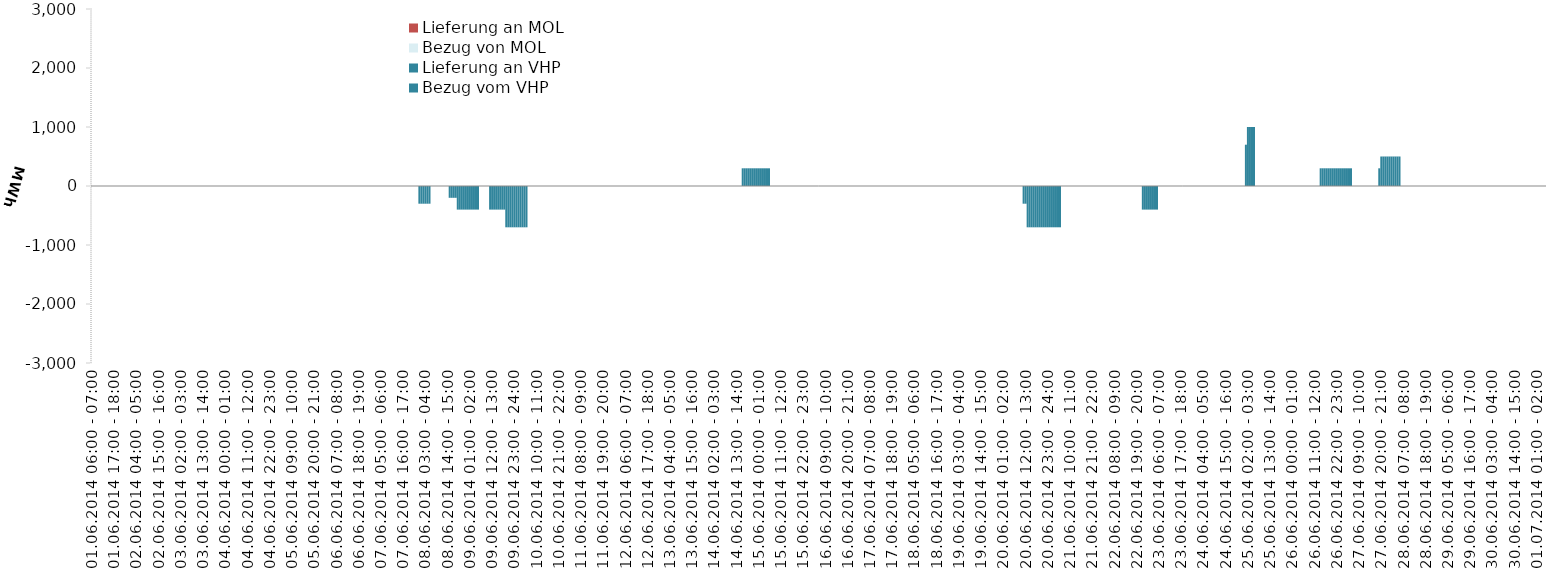
| Category | Bezug vom VHP | Lieferung an VHP | Bezug von MOL | Lieferung an MOL |
|---|---|---|---|---|
| 01.06.2014 06:00 - 07:00 | 0 | 0 | 0 | 0 |
| 01.06.2014 07:00 - 08:00 | 0 | 0 | 0 | 0 |
| 01.06.2014 08:00 - 09:00 | 0 | 0 | 0 | 0 |
| 01.06.2014 09:00 - 10:00 | 0 | 0 | 0 | 0 |
| 01.06.2014 10:00 - 11:00 | 0 | 0 | 0 | 0 |
| 01.06.2014 11:00 - 12:00 | 0 | 0 | 0 | 0 |
| 01.06.2014 12:00 - 13:00 | 0 | 0 | 0 | 0 |
| 01.06.2014 13:00 - 14:00 | 0 | 0 | 0 | 0 |
| 01.06.2014 14:00 - 15:00 | 0 | 0 | 0 | 0 |
| 01.06.2014 15:00 - 16:00 | 0 | 0 | 0 | 0 |
| 01.06.2014 16:00 - 17:00 | 0 | 0 | 0 | 0 |
| 01.06.2014 17:00 - 18:00 | 0 | 0 | 0 | 0 |
| 01.06.2014 18:00 - 19:00 | 0 | 0 | 0 | 0 |
| 01.06.2014 19:00 - 20:00 | 0 | 0 | 0 | 0 |
| 01.06.2014 20:00 - 21:00 | 0 | 0 | 0 | 0 |
| 01.06.2014 21:00 - 22:00 | 0 | 0 | 0 | 0 |
| 01.06.2014 22:00 - 23:00 | 0 | 0 | 0 | 0 |
| 01.06.2014 23:00 - 24:00 | 0 | 0 | 0 | 0 |
| 02.06.2014 00:00 - 01:00 | 0 | 0 | 0 | 0 |
| 02.06.2014 01:00 - 02:00 | 0 | 0 | 0 | 0 |
| 02.06.2014 02:00 - 03:00 | 0 | 0 | 0 | 0 |
| 02.06.2014 03:00 - 04:00 | 0 | 0 | 0 | 0 |
| 02.06.2014 04:00 - 05:00 | 0 | 0 | 0 | 0 |
| 02.06.2014 05:00 - 06:00 | 0 | 0 | 0 | 0 |
| 02.06.2014 06:00 - 07:00 | 0 | 0 | 0 | 0 |
| 02.06.2014 07:00 - 08:00 | 0 | 0 | 0 | 0 |
| 02.06.2014 08:00 - 09:00 | 0 | 0 | 0 | 0 |
| 02.06.2014 09:00 - 10:00 | 0 | 0 | 0 | 0 |
| 02.06.2014 10:00 - 11:00 | 0 | 0 | 0 | 0 |
| 02.06.2014 11:00 - 12:00 | 0 | 0 | 0 | 0 |
| 02.06.2014 12:00 - 13:00 | 0 | 0 | 0 | 0 |
| 02.06.2014 13:00 - 14:00 | 0 | 0 | 0 | 0 |
| 02.06.2014 14:00 - 15:00 | 0 | 0 | 0 | 0 |
| 02.06.2014 15:00 - 16:00 | 0 | 0 | 0 | 0 |
| 02.06.2014 16:00 - 17:00 | 0 | 0 | 0 | 0 |
| 02.06.2014 17:00 - 18:00 | 0 | 0 | 0 | 0 |
| 02.06.2014 18:00 - 19:00 | 0 | 0 | 0 | 0 |
| 02.06.2014 19:00 - 20:00 | 0 | 0 | 0 | 0 |
| 02.06.2014 20:00 - 21:00 | 0 | 0 | 0 | 0 |
| 02.06.2014 21:00 - 22:00 | 0 | 0 | 0 | 0 |
| 02.06.2014 22:00 - 23:00 | 0 | 0 | 0 | 0 |
| 02.06.2014 23:00 - 24:00 | 0 | 0 | 0 | 0 |
| 03.06.2014 00:00 - 01:00 | 0 | 0 | 0 | 0 |
| 03.06.2014 01:00 - 02:00 | 0 | 0 | 0 | 0 |
| 03.06.2014 02:00 - 03:00 | 0 | 0 | 0 | 0 |
| 03.06.2014 03:00 - 04:00 | 0 | 0 | 0 | 0 |
| 03.06.2014 04:00 - 05:00 | 0 | 0 | 0 | 0 |
| 03.06.2014 05:00 - 06:00 | 0 | 0 | 0 | 0 |
| 03.06.2014 06:00 - 07:00 | 0 | 0 | 0 | 0 |
| 03.06.2014 07:00 - 08:00 | 0 | 0 | 0 | 0 |
| 03.06.2014 08:00 - 09:00 | 0 | 0 | 0 | 0 |
| 03.06.2014 09:00 - 10:00 | 0 | 0 | 0 | 0 |
| 03.06.2014 10:00 - 11:00 | 0 | 0 | 0 | 0 |
| 03.06.2014 11:00 - 12:00 | 0 | 0 | 0 | 0 |
| 03.06.2014 12:00 - 13:00 | 0 | 0 | 0 | 0 |
| 03.06.2014 13:00 - 14:00 | 0 | 0 | 0 | 0 |
| 03.06.2014 14:00 - 15:00 | 0 | 0 | 0 | 0 |
| 03.06.2014 15:00 - 16:00 | 0 | 0 | 0 | 0 |
| 03.06.2014 16:00 - 17:00 | 0 | 0 | 0 | 0 |
| 03.06.2014 17:00 - 18:00 | 0 | 0 | 0 | 0 |
| 03.06.2014 18:00 - 19:00 | 0 | 0 | 0 | 0 |
| 03.06.2014 19:00 - 20:00 | 0 | 0 | 0 | 0 |
| 03.06.2014 20:00 - 21:00 | 0 | 0 | 0 | 0 |
| 03.06.2014 21:00 - 22:00 | 0 | 0 | 0 | 0 |
| 03.06.2014 22:00 - 23:00 | 0 | 0 | 0 | 0 |
| 03.06.2014 23:00 - 24:00 | 0 | 0 | 0 | 0 |
| 04.06.2014 00:00 - 01:00 | 0 | 0 | 0 | 0 |
| 04.06.2014 01:00 - 02:00 | 0 | 0 | 0 | 0 |
| 04.06.2014 02:00 - 03:00 | 0 | 0 | 0 | 0 |
| 04.06.2014 03:00 - 04:00 | 0 | 0 | 0 | 0 |
| 04.06.2014 04:00 - 05:00 | 0 | 0 | 0 | 0 |
| 04.06.2014 05:00 - 06:00 | 0 | 0 | 0 | 0 |
| 04.06.2014 06:00 - 07:00 | 0 | 0 | 0 | 0 |
| 04.06.2014 07:00 - 08:00 | 0 | 0 | 0 | 0 |
| 04.06.2014 08:00 - 09:00 | 0 | 0 | 0 | 0 |
| 04.06.2014 09:00 - 10:00 | 0 | 0 | 0 | 0 |
| 04.06.2014 10:00 - 11:00 | 0 | 0 | 0 | 0 |
| 04.06.2014 11:00 - 12:00 | 0 | 0 | 0 | 0 |
| 04.06.2014 12:00 - 13:00 | 0 | 0 | 0 | 0 |
| 04.06.2014 13:00 - 14:00 | 0 | 0 | 0 | 0 |
| 04.06.2014 14:00 - 15:00 | 0 | 0 | 0 | 0 |
| 04.06.2014 15:00 - 16:00 | 0 | 0 | 0 | 0 |
| 04.06.2014 16:00 - 17:00 | 0 | 0 | 0 | 0 |
| 04.06.2014 17:00 - 18:00 | 0 | 0 | 0 | 0 |
| 04.06.2014 18:00 - 19:00 | 0 | 0 | 0 | 0 |
| 04.06.2014 19:00 - 20:00 | 0 | 0 | 0 | 0 |
| 04.06.2014 20:00 - 21:00 | 0 | 0 | 0 | 0 |
| 04.06.2014 21:00 - 22:00 | 0 | 0 | 0 | 0 |
| 04.06.2014 22:00 - 23:00 | 0 | 0 | 0 | 0 |
| 04.06.2014 23:00 - 24:00 | 0 | 0 | 0 | 0 |
| 05.06.2014 00:00 - 01:00 | 0 | 0 | 0 | 0 |
| 05.06.2014 01:00 - 02:00 | 0 | 0 | 0 | 0 |
| 05.06.2014 02:00 - 03:00 | 0 | 0 | 0 | 0 |
| 05.06.2014 03:00 - 04:00 | 0 | 0 | 0 | 0 |
| 05.06.2014 04:00 - 05:00 | 0 | 0 | 0 | 0 |
| 05.06.2014 05:00 - 06:00 | 0 | 0 | 0 | 0 |
| 05.06.2014 06:00 - 07:00 | 0 | 0 | 0 | 0 |
| 05.06.2014 07:00 - 08:00 | 0 | 0 | 0 | 0 |
| 05.06.2014 08:00 - 09:00 | 0 | 0 | 0 | 0 |
| 05.06.2014 09:00 - 10:00 | 0 | 0 | 0 | 0 |
| 05.06.2014 10:00 - 11:00 | 0 | 0 | 0 | 0 |
| 05.06.2014 11:00 - 12:00 | 0 | 0 | 0 | 0 |
| 05.06.2014 12:00 - 13:00 | 0 | 0 | 0 | 0 |
| 05.06.2014 13:00 - 14:00 | 0 | 0 | 0 | 0 |
| 05.06.2014 14:00 - 15:00 | 0 | 0 | 0 | 0 |
| 05.06.2014 15:00 - 16:00 | 0 | 0 | 0 | 0 |
| 05.06.2014 16:00 - 17:00 | 0 | 0 | 0 | 0 |
| 05.06.2014 17:00 - 18:00 | 0 | 0 | 0 | 0 |
| 05.06.2014 18:00 - 19:00 | 0 | 0 | 0 | 0 |
| 05.06.2014 19:00 - 20:00 | 0 | 0 | 0 | 0 |
| 05.06.2014 20:00 - 21:00 | 0 | 0 | 0 | 0 |
| 05.06.2014 21:00 - 22:00 | 0 | 0 | 0 | 0 |
| 05.06.2014 22:00 - 23:00 | 0 | 0 | 0 | 0 |
| 05.06.2014 23:00 - 24:00 | 0 | 0 | 0 | 0 |
| 06.06.2014 00:00 - 01:00 | 0 | 0 | 0 | 0 |
| 06.06.2014 01:00 - 02:00 | 0 | 0 | 0 | 0 |
| 06.06.2014 02:00 - 03:00 | 0 | 0 | 0 | 0 |
| 06.06.2014 03:00 - 04:00 | 0 | 0 | 0 | 0 |
| 06.06.2014 04:00 - 05:00 | 0 | 0 | 0 | 0 |
| 06.06.2014 05:00 - 06:00 | 0 | 0 | 0 | 0 |
| 06.06.2014 06:00 - 07:00 | 0 | 0 | 0 | 0 |
| 06.06.2014 07:00 - 08:00 | 0 | 0 | 0 | 0 |
| 06.06.2014 08:00 - 09:00 | 0 | 0 | 0 | 0 |
| 06.06.2014 09:00 - 10:00 | 0 | 0 | 0 | 0 |
| 06.06.2014 10:00 - 11:00 | 0 | 0 | 0 | 0 |
| 06.06.2014 11:00 - 12:00 | 0 | 0 | 0 | 0 |
| 06.06.2014 12:00 - 13:00 | 0 | 0 | 0 | 0 |
| 06.06.2014 13:00 - 14:00 | 0 | 0 | 0 | 0 |
| 06.06.2014 14:00 - 15:00 | 0 | 0 | 0 | 0 |
| 06.06.2014 15:00 - 16:00 | 0 | 0 | 0 | 0 |
| 06.06.2014 16:00 - 17:00 | 0 | 0 | 0 | 0 |
| 06.06.2014 17:00 - 18:00 | 0 | 0 | 0 | 0 |
| 06.06.2014 18:00 - 19:00 | 0 | 0 | 0 | 0 |
| 06.06.2014 19:00 - 20:00 | 0 | 0 | 0 | 0 |
| 06.06.2014 20:00 - 21:00 | 0 | 0 | 0 | 0 |
| 06.06.2014 21:00 - 22:00 | 0 | 0 | 0 | 0 |
| 06.06.2014 22:00 - 23:00 | 0 | 0 | 0 | 0 |
| 06.06.2014 23:00 - 24:00 | 0 | 0 | 0 | 0 |
| 07.06.2014 00:00 - 01:00 | 0 | 0 | 0 | 0 |
| 07.06.2014 01:00 - 02:00 | 0 | 0 | 0 | 0 |
| 07.06.2014 02:00 - 03:00 | 0 | 0 | 0 | 0 |
| 07.06.2014 03:00 - 04:00 | 0 | 0 | 0 | 0 |
| 07.06.2014 04:00 - 05:00 | 0 | 0 | 0 | 0 |
| 07.06.2014 05:00 - 06:00 | 0 | 0 | 0 | 0 |
| 07.06.2014 06:00 - 07:00 | 0 | 0 | 0 | 0 |
| 07.06.2014 07:00 - 08:00 | 0 | 0 | 0 | 0 |
| 07.06.2014 08:00 - 09:00 | 0 | 0 | 0 | 0 |
| 07.06.2014 09:00 - 10:00 | 0 | 0 | 0 | 0 |
| 07.06.2014 10:00 - 11:00 | 0 | 0 | 0 | 0 |
| 07.06.2014 11:00 - 12:00 | 0 | 0 | 0 | 0 |
| 07.06.2014 12:00 - 13:00 | 0 | 0 | 0 | 0 |
| 07.06.2014 13:00 - 14:00 | 0 | 0 | 0 | 0 |
| 07.06.2014 14:00 - 15:00 | 0 | 0 | 0 | 0 |
| 07.06.2014 15:00 - 16:00 | 0 | 0 | 0 | 0 |
| 07.06.2014 16:00 - 17:00 | 0 | 0 | 0 | 0 |
| 07.06.2014 17:00 - 18:00 | 0 | 0 | 0 | 0 |
| 07.06.2014 18:00 - 19:00 | 0 | 0 | 0 | 0 |
| 07.06.2014 19:00 - 20:00 | 0 | 0 | 0 | 0 |
| 07.06.2014 20:00 - 21:00 | 0 | 0 | 0 | 0 |
| 07.06.2014 21:00 - 22:00 | 0 | 0 | 0 | 0 |
| 07.06.2014 22:00 - 23:00 | 0 | 0 | 0 | 0 |
| 07.06.2014 23:00 - 24:00 | 0 | 0 | 0 | 0 |
| 08.06.2014 00:00 - 01:00 | 0 | -300 | 0 | 0 |
| 08.06.2014 01:00 - 02:00 | 0 | -300 | 0 | 0 |
| 08.06.2014 02:00 - 03:00 | 0 | -300 | 0 | 0 |
| 08.06.2014 03:00 - 04:00 | 0 | -300 | 0 | 0 |
| 08.06.2014 04:00 - 05:00 | 0 | -300 | 0 | 0 |
| 08.06.2014 05:00 - 06:00 | 0 | -300 | 0 | 0 |
| 08.06.2014 06:00 - 07:00 | 0 | 0 | 0 | 0 |
| 08.06.2014 07:00 - 08:00 | 0 | 0 | 0 | 0 |
| 08.06.2014 08:00 - 09:00 | 0 | 0 | 0 | 0 |
| 08.06.2014 09:00 - 10:00 | 0 | 0 | 0 | 0 |
| 08.06.2014 10:00 - 11:00 | 0 | 0 | 0 | 0 |
| 08.06.2014 11:00 - 12:00 | 0 | 0 | 0 | 0 |
| 08.06.2014 12:00 - 13:00 | 0 | 0 | 0 | 0 |
| 08.06.2014 13:00 - 14:00 | 0 | 0 | 0 | 0 |
| 08.06.2014 14:00 - 15:00 | 0 | 0 | 0 | 0 |
| 08.06.2014 15:00 - 16:00 | 0 | -200 | 0 | 0 |
| 08.06.2014 16:00 - 17:00 | 0 | -200 | 0 | 0 |
| 08.06.2014 17:00 - 18:00 | 0 | -200 | 0 | 0 |
| 08.06.2014 18:00 - 19:00 | 0 | -200 | 0 | 0 |
| 08.06.2014 19:00 - 20:00 | 0 | -400 | 0 | 0 |
| 08.06.2014 20:00 - 21:00 | 0 | -400 | 0 | 0 |
| 08.06.2014 21:00 - 22:00 | 0 | -400 | 0 | 0 |
| 08.06.2014 22:00 - 23:00 | 0 | -400 | 0 | 0 |
| 08.06.2014 23:00 - 24:00 | 0 | -400 | 0 | 0 |
| 09.06.2014 00:00 - 01:00 | 0 | -400 | 0 | 0 |
| 09.06.2014 01:00 - 02:00 | 0 | -400 | 0 | 0 |
| 09.06.2014 02:00 - 03:00 | 0 | -400 | 0 | 0 |
| 09.06.2014 03:00 - 04:00 | 0 | -400 | 0 | 0 |
| 09.06.2014 04:00 - 05:00 | 0 | -400 | 0 | 0 |
| 09.06.2014 05:00 - 06:00 | 0 | -400 | 0 | 0 |
| 09.06.2014 06:00 - 07:00 | 0 | 0 | 0 | 0 |
| 09.06.2014 07:00 - 08:00 | 0 | 0 | 0 | 0 |
| 09.06.2014 08:00 - 09:00 | 0 | 0 | 0 | 0 |
| 09.06.2014 09:00 - 10:00 | 0 | 0 | 0 | 0 |
| 09.06.2014 10:00 - 11:00 | 0 | 0 | 0 | 0 |
| 09.06.2014 11:00 - 12:00 | 0 | -400 | 0 | 0 |
| 09.06.2014 12:00 - 13:00 | 0 | -400 | 0 | 0 |
| 09.06.2014 13:00 - 14:00 | 0 | -400 | 0 | 0 |
| 09.06.2014 14:00 - 15:00 | 0 | -400 | 0 | 0 |
| 09.06.2014 15:00 - 16:00 | 0 | -400 | 0 | 0 |
| 09.06.2014 16:00 - 17:00 | 0 | -400 | 0 | 0 |
| 09.06.2014 17:00 - 18:00 | 0 | -400 | 0 | 0 |
| 09.06.2014 18:00 - 19:00 | 0 | -400 | 0 | 0 |
| 09.06.2014 19:00 - 20:00 | 0 | -700 | 0 | 0 |
| 09.06.2014 20:00 - 21:00 | 0 | -700 | 0 | 0 |
| 09.06.2014 21:00 - 22:00 | 0 | -700 | 0 | 0 |
| 09.06.2014 22:00 - 23:00 | 0 | -700 | 0 | 0 |
| 09.06.2014 23:00 - 24:00 | 0 | -700 | 0 | 0 |
| 10.06.2014 00:00 - 01:00 | 0 | -700 | 0 | 0 |
| 10.06.2014 01:00 - 02:00 | 0 | -700 | 0 | 0 |
| 10.06.2014 02:00 - 03:00 | 0 | -700 | 0 | 0 |
| 10.06.2014 03:00 - 04:00 | 0 | -700 | 0 | 0 |
| 10.06.2014 04:00 - 05:00 | 0 | -700 | 0 | 0 |
| 10.06.2014 05:00 - 06:00 | 0 | -700 | 0 | 0 |
| 10.06.2014 06:00 - 07:00 | 0 | 0 | 0 | 0 |
| 10.06.2014 07:00 - 08:00 | 0 | 0 | 0 | 0 |
| 10.06.2014 08:00 - 09:00 | 0 | 0 | 0 | 0 |
| 10.06.2014 09:00 - 10:00 | 0 | 0 | 0 | 0 |
| 10.06.2014 10:00 - 11:00 | 0 | 0 | 0 | 0 |
| 10.06.2014 11:00 - 12:00 | 0 | 0 | 0 | 0 |
| 10.06.2014 12:00 - 13:00 | 0 | 0 | 0 | 0 |
| 10.06.2014 13:00 - 14:00 | 0 | 0 | 0 | 0 |
| 10.06.2014 14:00 - 15:00 | 0 | 0 | 0 | 0 |
| 10.06.2014 15:00 - 16:00 | 0 | 0 | 0 | 0 |
| 10.06.2014 16:00 - 17:00 | 0 | 0 | 0 | 0 |
| 10.06.2014 17:00 - 18:00 | 0 | 0 | 0 | 0 |
| 10.06.2014 18:00 - 19:00 | 0 | 0 | 0 | 0 |
| 10.06.2014 19:00 - 20:00 | 0 | 0 | 0 | 0 |
| 10.06.2014 20:00 - 21:00 | 0 | 0 | 0 | 0 |
| 10.06.2014 21:00 - 22:00 | 0 | 0 | 0 | 0 |
| 10.06.2014 22:00 - 23:00 | 0 | 0 | 0 | 0 |
| 10.06.2014 23:00 - 24:00 | 0 | 0 | 0 | 0 |
| 11.06.2014 00:00 - 01:00 | 0 | 0 | 0 | 0 |
| 11.06.2014 01:00 - 02:00 | 0 | 0 | 0 | 0 |
| 11.06.2014 02:00 - 03:00 | 0 | 0 | 0 | 0 |
| 11.06.2014 03:00 - 04:00 | 0 | 0 | 0 | 0 |
| 11.06.2014 04:00 - 05:00 | 0 | 0 | 0 | 0 |
| 11.06.2014 05:00 - 06:00 | 0 | 0 | 0 | 0 |
| 11.06.2014 06:00 - 07:00 | 0 | 0 | 0 | 0 |
| 11.06.2014 07:00 - 08:00 | 0 | 0 | 0 | 0 |
| 11.06.2014 08:00 - 09:00 | 0 | 0 | 0 | 0 |
| 11.06.2014 09:00 - 10:00 | 0 | 0 | 0 | 0 |
| 11.06.2014 10:00 - 11:00 | 0 | 0 | 0 | 0 |
| 11.06.2014 11:00 - 12:00 | 0 | 0 | 0 | 0 |
| 11.06.2014 12:00 - 13:00 | 0 | 0 | 0 | 0 |
| 11.06.2014 13:00 - 14:00 | 0 | 0 | 0 | 0 |
| 11.06.2014 14:00 - 15:00 | 0 | 0 | 0 | 0 |
| 11.06.2014 15:00 - 16:00 | 0 | 0 | 0 | 0 |
| 11.06.2014 16:00 - 17:00 | 0 | 0 | 0 | 0 |
| 11.06.2014 17:00 - 18:00 | 0 | 0 | 0 | 0 |
| 11.06.2014 18:00 - 19:00 | 0 | 0 | 0 | 0 |
| 11.06.2014 19:00 - 20:00 | 0 | 0 | 0 | 0 |
| 11.06.2014 20:00 - 21:00 | 0 | 0 | 0 | 0 |
| 11.06.2014 21:00 - 22:00 | 0 | 0 | 0 | 0 |
| 11.06.2014 22:00 - 23:00 | 0 | 0 | 0 | 0 |
| 11.06.2014 23:00 - 24:00 | 0 | 0 | 0 | 0 |
| 12.06.2014 00:00 - 01:00 | 0 | 0 | 0 | 0 |
| 12.06.2014 01:00 - 02:00 | 0 | 0 | 0 | 0 |
| 12.06.2014 02:00 - 03:00 | 0 | 0 | 0 | 0 |
| 12.06.2014 03:00 - 04:00 | 0 | 0 | 0 | 0 |
| 12.06.2014 04:00 - 05:00 | 0 | 0 | 0 | 0 |
| 12.06.2014 05:00 - 06:00 | 0 | 0 | 0 | 0 |
| 12.06.2014 06:00 - 07:00 | 0 | 0 | 0 | 0 |
| 12.06.2014 07:00 - 08:00 | 0 | 0 | 0 | 0 |
| 12.06.2014 08:00 - 09:00 | 0 | 0 | 0 | 0 |
| 12.06.2014 09:00 - 10:00 | 0 | 0 | 0 | 0 |
| 12.06.2014 10:00 - 11:00 | 0 | 0 | 0 | 0 |
| 12.06.2014 11:00 - 12:00 | 0 | 0 | 0 | 0 |
| 12.06.2014 12:00 - 13:00 | 0 | 0 | 0 | 0 |
| 12.06.2014 13:00 - 14:00 | 0 | 0 | 0 | 0 |
| 12.06.2014 14:00 - 15:00 | 0 | 0 | 0 | 0 |
| 12.06.2014 15:00 - 16:00 | 0 | 0 | 0 | 0 |
| 12.06.2014 16:00 - 17:00 | 0 | 0 | 0 | 0 |
| 12.06.2014 17:00 - 18:00 | 0 | 0 | 0 | 0 |
| 12.06.2014 18:00 - 19:00 | 0 | 0 | 0 | 0 |
| 12.06.2014 19:00 - 20:00 | 0 | 0 | 0 | 0 |
| 12.06.2014 20:00 - 21:00 | 0 | 0 | 0 | 0 |
| 12.06.2014 21:00 - 22:00 | 0 | 0 | 0 | 0 |
| 12.06.2014 22:00 - 23:00 | 0 | 0 | 0 | 0 |
| 12.06.2014 23:00 - 24:00 | 0 | 0 | 0 | 0 |
| 13.06.2014 00:00 - 01:00 | 0 | 0 | 0 | 0 |
| 13.06.2014 01:00 - 02:00 | 0 | 0 | 0 | 0 |
| 13.06.2014 02:00 - 03:00 | 0 | 0 | 0 | 0 |
| 13.06.2014 03:00 - 04:00 | 0 | 0 | 0 | 0 |
| 13.06.2014 04:00 - 05:00 | 0 | 0 | 0 | 0 |
| 13.06.2014 05:00 - 06:00 | 0 | 0 | 0 | 0 |
| 13.06.2014 06:00 - 07:00 | 0 | 0 | 0 | 0 |
| 13.06.2014 07:00 - 08:00 | 0 | 0 | 0 | 0 |
| 13.06.2014 08:00 - 09:00 | 0 | 0 | 0 | 0 |
| 13.06.2014 09:00 - 10:00 | 0 | 0 | 0 | 0 |
| 13.06.2014 10:00 - 11:00 | 0 | 0 | 0 | 0 |
| 13.06.2014 11:00 - 12:00 | 0 | 0 | 0 | 0 |
| 13.06.2014 12:00 - 13:00 | 0 | 0 | 0 | 0 |
| 13.06.2014 13:00 - 14:00 | 0 | 0 | 0 | 0 |
| 13.06.2014 14:00 - 15:00 | 0 | 0 | 0 | 0 |
| 13.06.2014 15:00 - 16:00 | 0 | 0 | 0 | 0 |
| 13.06.2014 16:00 - 17:00 | 0 | 0 | 0 | 0 |
| 13.06.2014 17:00 - 18:00 | 0 | 0 | 0 | 0 |
| 13.06.2014 18:00 - 19:00 | 0 | 0 | 0 | 0 |
| 13.06.2014 19:00 - 20:00 | 0 | 0 | 0 | 0 |
| 13.06.2014 20:00 - 21:00 | 0 | 0 | 0 | 0 |
| 13.06.2014 21:00 - 22:00 | 0 | 0 | 0 | 0 |
| 13.06.2014 22:00 - 23:00 | 0 | 0 | 0 | 0 |
| 13.06.2014 23:00 - 24:00 | 0 | 0 | 0 | 0 |
| 14.06.2014 00:00 - 01:00 | 0 | 0 | 0 | 0 |
| 14.06.2014 01:00 - 02:00 | 0 | 0 | 0 | 0 |
| 14.06.2014 02:00 - 03:00 | 0 | 0 | 0 | 0 |
| 14.06.2014 03:00 - 04:00 | 0 | 0 | 0 | 0 |
| 14.06.2014 04:00 - 05:00 | 0 | 0 | 0 | 0 |
| 14.06.2014 05:00 - 06:00 | 0 | 0 | 0 | 0 |
| 14.06.2014 06:00 - 07:00 | 0 | 0 | 0 | 0 |
| 14.06.2014 07:00 - 08:00 | 0 | 0 | 0 | 0 |
| 14.06.2014 08:00 - 09:00 | 0 | 0 | 0 | 0 |
| 14.06.2014 09:00 - 10:00 | 0 | 0 | 0 | 0 |
| 14.06.2014 10:00 - 11:00 | 0 | 0 | 0 | 0 |
| 14.06.2014 11:00 - 12:00 | 0 | 0 | 0 | 0 |
| 14.06.2014 12:00 - 13:00 | 0 | 0 | 0 | 0 |
| 14.06.2014 13:00 - 14:00 | 0 | 0 | 0 | 0 |
| 14.06.2014 14:00 - 15:00 | 0 | 0 | 0 | 0 |
| 14.06.2014 15:00 - 16:00 | 0 | 0 | 0 | 0 |
| 14.06.2014 16:00 - 17:00 | 300 | 0 | 0 | 0 |
| 14.06.2014 17:00 - 18:00 | 300 | 0 | 0 | 0 |
| 14.06.2014 18:00 - 19:00 | 300 | 0 | 0 | 0 |
| 14.06.2014 19:00 - 20:00 | 300 | 0 | 0 | 0 |
| 14.06.2014 20:00 - 21:00 | 300 | 0 | 0 | 0 |
| 14.06.2014 21:00 - 22:00 | 300 | 0 | 0 | 0 |
| 14.06.2014 22:00 - 23:00 | 300 | 0 | 0 | 0 |
| 14.06.2014 23:00 - 24:00 | 300 | 0 | 0 | 0 |
| 15.06.2014 00:00 - 01:00 | 300 | 0 | 0 | 0 |
| 15.06.2014 01:00 - 02:00 | 300 | 0 | 0 | 0 |
| 15.06.2014 02:00 - 03:00 | 300 | 0 | 0 | 0 |
| 15.06.2014 03:00 - 04:00 | 300 | 0 | 0 | 0 |
| 15.06.2014 04:00 - 05:00 | 300 | 0 | 0 | 0 |
| 15.06.2014 05:00 - 06:00 | 300 | 0 | 0 | 0 |
| 15.06.2014 06:00 - 07:00 | 0 | 0 | 0 | 0 |
| 15.06.2014 07:00 - 08:00 | 0 | 0 | 0 | 0 |
| 15.06.2014 08:00 - 09:00 | 0 | 0 | 0 | 0 |
| 15.06.2014 09:00 - 10:00 | 0 | 0 | 0 | 0 |
| 15.06.2014 10:00 - 11:00 | 0 | 0 | 0 | 0 |
| 15.06.2014 11:00 - 12:00 | 0 | 0 | 0 | 0 |
| 15.06.2014 12:00 - 13:00 | 0 | 0 | 0 | 0 |
| 15.06.2014 13:00 - 14:00 | 0 | 0 | 0 | 0 |
| 15.06.2014 14:00 - 15:00 | 0 | 0 | 0 | 0 |
| 15.06.2014 15:00 - 16:00 | 0 | 0 | 0 | 0 |
| 15.06.2014 16:00 - 17:00 | 0 | 0 | 0 | 0 |
| 15.06.2014 17:00 - 18:00 | 0 | 0 | 0 | 0 |
| 15.06.2014 18:00 - 19:00 | 0 | 0 | 0 | 0 |
| 15.06.2014 19:00 - 20:00 | 0 | 0 | 0 | 0 |
| 15.06.2014 20:00 - 21:00 | 0 | 0 | 0 | 0 |
| 15.06.2014 21:00 - 22:00 | 0 | 0 | 0 | 0 |
| 15.06.2014 22:00 - 23:00 | 0 | 0 | 0 | 0 |
| 15.06.2014 23:00 - 24:00 | 0 | 0 | 0 | 0 |
| 16.06.2014 00:00 - 01:00 | 0 | 0 | 0 | 0 |
| 16.06.2014 01:00 - 02:00 | 0 | 0 | 0 | 0 |
| 16.06.2014 02:00 - 03:00 | 0 | 0 | 0 | 0 |
| 16.06.2014 03:00 - 04:00 | 0 | 0 | 0 | 0 |
| 16.06.2014 04:00 - 05:00 | 0 | 0 | 0 | 0 |
| 16.06.2014 05:00 - 06:00 | 0 | 0 | 0 | 0 |
| 16.06.2014 06:00 - 07:00 | 0 | 0 | 0 | 0 |
| 16.06.2014 07:00 - 08:00 | 0 | 0 | 0 | 0 |
| 16.06.2014 08:00 - 09:00 | 0 | 0 | 0 | 0 |
| 16.06.2014 09:00 - 10:00 | 0 | 0 | 0 | 0 |
| 16.06.2014 10:00 - 11:00 | 0 | 0 | 0 | 0 |
| 16.06.2014 11:00 - 12:00 | 0 | 0 | 0 | 0 |
| 16.06.2014 12:00 - 13:00 | 0 | 0 | 0 | 0 |
| 16.06.2014 13:00 - 14:00 | 0 | 0 | 0 | 0 |
| 16.06.2014 14:00 - 15:00 | 0 | 0 | 0 | 0 |
| 16.06.2014 15:00 - 16:00 | 0 | 0 | 0 | 0 |
| 16.06.2014 16:00 - 17:00 | 0 | 0 | 0 | 0 |
| 16.06.2014 17:00 - 18:00 | 0 | 0 | 0 | 0 |
| 16.06.2014 18:00 - 19:00 | 0 | 0 | 0 | 0 |
| 16.06.2014 19:00 - 20:00 | 0 | 0 | 0 | 0 |
| 16.06.2014 20:00 - 21:00 | 0 | 0 | 0 | 0 |
| 16.06.2014 21:00 - 22:00 | 0 | 0 | 0 | 0 |
| 16.06.2014 22:00 - 23:00 | 0 | 0 | 0 | 0 |
| 16.06.2014 23:00 - 24:00 | 0 | 0 | 0 | 0 |
| 17.06.2014 00:00 - 01:00 | 0 | 0 | 0 | 0 |
| 17.06.2014 01:00 - 02:00 | 0 | 0 | 0 | 0 |
| 17.06.2014 02:00 - 03:00 | 0 | 0 | 0 | 0 |
| 17.06.2014 03:00 - 04:00 | 0 | 0 | 0 | 0 |
| 17.06.2014 04:00 - 05:00 | 0 | 0 | 0 | 0 |
| 17.06.2014 05:00 - 06:00 | 0 | 0 | 0 | 0 |
| 17.06.2014 06:00 - 07:00 | 0 | 0 | 0 | 0 |
| 17.06.2014 07:00 - 08:00 | 0 | 0 | 0 | 0 |
| 17.06.2014 08:00 - 09:00 | 0 | 0 | 0 | 0 |
| 17.06.2014 09:00 - 10:00 | 0 | 0 | 0 | 0 |
| 17.06.2014 10:00 - 11:00 | 0 | 0 | 0 | 0 |
| 17.06.2014 11:00 - 12:00 | 0 | 0 | 0 | 0 |
| 17.06.2014 12:00 - 13:00 | 0 | 0 | 0 | 0 |
| 17.06.2014 13:00 - 14:00 | 0 | 0 | 0 | 0 |
| 17.06.2014 14:00 - 15:00 | 0 | 0 | 0 | 0 |
| 17.06.2014 15:00 - 16:00 | 0 | 0 | 0 | 0 |
| 17.06.2014 16:00 - 17:00 | 0 | 0 | 0 | 0 |
| 17.06.2014 17:00 - 18:00 | 0 | 0 | 0 | 0 |
| 17.06.2014 18:00 - 19:00 | 0 | 0 | 0 | 0 |
| 17.06.2014 19:00 - 20:00 | 0 | 0 | 0 | 0 |
| 17.06.2014 20:00 - 21:00 | 0 | 0 | 0 | 0 |
| 17.06.2014 21:00 - 22:00 | 0 | 0 | 0 | 0 |
| 17.06.2014 22:00 - 23:00 | 0 | 0 | 0 | 0 |
| 17.06.2014 23:00 - 24:00 | 0 | 0 | 0 | 0 |
| 18.06.2014 00:00 - 01:00 | 0 | 0 | 0 | 0 |
| 18.06.2014 01:00 - 02:00 | 0 | 0 | 0 | 0 |
| 18.06.2014 02:00 - 03:00 | 0 | 0 | 0 | 0 |
| 18.06.2014 03:00 - 04:00 | 0 | 0 | 0 | 0 |
| 18.06.2014 04:00 - 05:00 | 0 | 0 | 0 | 0 |
| 18.06.2014 05:00 - 06:00 | 0 | 0 | 0 | 0 |
| 18.06.2014 06:00 - 07:00 | 0 | 0 | 0 | 0 |
| 18.06.2014 07:00 - 08:00 | 0 | 0 | 0 | 0 |
| 18.06.2014 08:00 - 09:00 | 0 | 0 | 0 | 0 |
| 18.06.2014 09:00 - 10:00 | 0 | 0 | 0 | 0 |
| 18.06.2014 10:00 - 11:00 | 0 | 0 | 0 | 0 |
| 18.06.2014 11:00 - 12:00 | 0 | 0 | 0 | 0 |
| 18.06.2014 12:00 - 13:00 | 0 | 0 | 0 | 0 |
| 18.06.2014 13:00 - 14:00 | 0 | 0 | 0 | 0 |
| 18.06.2014 14:00 - 15:00 | 0 | 0 | 0 | 0 |
| 18.06.2014 15:00 - 16:00 | 0 | 0 | 0 | 0 |
| 18.06.2014 16:00 - 17:00 | 0 | 0 | 0 | 0 |
| 18.06.2014 17:00 - 18:00 | 0 | 0 | 0 | 0 |
| 18.06.2014 18:00 - 19:00 | 0 | 0 | 0 | 0 |
| 18.06.2014 19:00 - 20:00 | 0 | 0 | 0 | 0 |
| 18.06.2014 20:00 - 21:00 | 0 | 0 | 0 | 0 |
| 18.06.2014 21:00 - 22:00 | 0 | 0 | 0 | 0 |
| 18.06.2014 22:00 - 23:00 | 0 | 0 | 0 | 0 |
| 18.06.2014 23:00 - 24:00 | 0 | 0 | 0 | 0 |
| 19.06.2014 00:00 - 01:00 | 0 | 0 | 0 | 0 |
| 19.06.2014 01:00 - 02:00 | 0 | 0 | 0 | 0 |
| 19.06.2014 02:00 - 03:00 | 0 | 0 | 0 | 0 |
| 19.06.2014 03:00 - 04:00 | 0 | 0 | 0 | 0 |
| 19.06.2014 04:00 - 05:00 | 0 | 0 | 0 | 0 |
| 19.06.2014 05:00 - 06:00 | 0 | 0 | 0 | 0 |
| 19.06.2014 06:00 - 07:00 | 0 | 0 | 0 | 0 |
| 19.06.2014 07:00 - 08:00 | 0 | 0 | 0 | 0 |
| 19.06.2014 08:00 - 09:00 | 0 | 0 | 0 | 0 |
| 19.06.2014 09:00 - 10:00 | 0 | 0 | 0 | 0 |
| 19.06.2014 10:00 - 11:00 | 0 | 0 | 0 | 0 |
| 19.06.2014 11:00 - 12:00 | 0 | 0 | 0 | 0 |
| 19.06.2014 12:00 - 13:00 | 0 | 0 | 0 | 0 |
| 19.06.2014 13:00 - 14:00 | 0 | 0 | 0 | 0 |
| 19.06.2014 14:00 - 15:00 | 0 | 0 | 0 | 0 |
| 19.06.2014 15:00 - 16:00 | 0 | 0 | 0 | 0 |
| 19.06.2014 16:00 - 17:00 | 0 | 0 | 0 | 0 |
| 19.06.2014 17:00 - 18:00 | 0 | 0 | 0 | 0 |
| 19.06.2014 18:00 - 19:00 | 0 | 0 | 0 | 0 |
| 19.06.2014 19:00 - 20:00 | 0 | 0 | 0 | 0 |
| 19.06.2014 20:00 - 21:00 | 0 | 0 | 0 | 0 |
| 19.06.2014 21:00 - 22:00 | 0 | 0 | 0 | 0 |
| 19.06.2014 22:00 - 23:00 | 0 | 0 | 0 | 0 |
| 19.06.2014 23:00 - 24:00 | 0 | 0 | 0 | 0 |
| 20.06.2014 00:00 - 01:00 | 0 | 0 | 0 | 0 |
| 20.06.2014 01:00 - 02:00 | 0 | 0 | 0 | 0 |
| 20.06.2014 02:00 - 03:00 | 0 | 0 | 0 | 0 |
| 20.06.2014 03:00 - 04:00 | 0 | 0 | 0 | 0 |
| 20.06.2014 04:00 - 05:00 | 0 | 0 | 0 | 0 |
| 20.06.2014 05:00 - 06:00 | 0 | 0 | 0 | 0 |
| 20.06.2014 06:00 - 07:00 | 0 | 0 | 0 | 0 |
| 20.06.2014 07:00 - 08:00 | 0 | 0 | 0 | 0 |
| 20.06.2014 08:00 - 09:00 | 0 | 0 | 0 | 0 |
| 20.06.2014 09:00 - 10:00 | 0 | 0 | 0 | 0 |
| 20.06.2014 10:00 - 11:00 | 0 | 0 | 0 | 0 |
| 20.06.2014 11:00 - 12:00 | 0 | -300 | 0 | 0 |
| 20.06.2014 12:00 - 13:00 | 0 | -300 | 0 | 0 |
| 20.06.2014 13:00 - 14:00 | 0 | -700 | 0 | 0 |
| 20.06.2014 14:00 - 15:00 | 0 | -700 | 0 | 0 |
| 20.06.2014 15:00 - 16:00 | 0 | -700 | 0 | 0 |
| 20.06.2014 16:00 - 17:00 | 0 | -700 | 0 | 0 |
| 20.06.2014 17:00 - 18:00 | 0 | -700 | 0 | 0 |
| 20.06.2014 18:00 - 19:00 | 0 | -700 | 0 | 0 |
| 20.06.2014 19:00 - 20:00 | 0 | -700 | 0 | 0 |
| 20.06.2014 20:00 - 21:00 | 0 | -700 | 0 | 0 |
| 20.06.2014 21:00 - 22:00 | 0 | -700 | 0 | 0 |
| 20.06.2014 22:00 - 23:00 | 0 | -700 | 0 | 0 |
| 20.06.2014 23:00 - 24:00 | 0 | -700 | 0 | 0 |
| 21.06.2014 00:00 - 01:00 | 0 | -700 | 0 | 0 |
| 21.06.2014 01:00 - 02:00 | 0 | -700 | 0 | 0 |
| 21.06.2014 02:00 - 03:00 | 0 | -700 | 0 | 0 |
| 21.06.2014 03:00 - 04:00 | 0 | -700 | 0 | 0 |
| 21.06.2014 04:00 - 05:00 | 0 | -700 | 0 | 0 |
| 21.06.2014 05:00 - 06:00 | 0 | -700 | 0 | 0 |
| 21.06.2014 06:00 - 07:00 | 0 | 0 | 0 | 0 |
| 21.06.2014 07:00 - 08:00 | 0 | 0 | 0 | 0 |
| 21.06.2014 08:00 - 09:00 | 0 | 0 | 0 | 0 |
| 21.06.2014 09:00 - 10:00 | 0 | 0 | 0 | 0 |
| 21.06.2014 10:00 - 11:00 | 0 | 0 | 0 | 0 |
| 21.06.2014 11:00 - 12:00 | 0 | 0 | 0 | 0 |
| 21.06.2014 12:00 - 13:00 | 0 | 0 | 0 | 0 |
| 21.06.2014 13:00 - 14:00 | 0 | 0 | 0 | 0 |
| 21.06.2014 14:00 - 15:00 | 0 | 0 | 0 | 0 |
| 21.06.2014 15:00 - 16:00 | 0 | 0 | 0 | 0 |
| 21.06.2014 16:00 - 17:00 | 0 | 0 | 0 | 0 |
| 21.06.2014 17:00 - 18:00 | 0 | 0 | 0 | 0 |
| 21.06.2014 18:00 - 19:00 | 0 | 0 | 0 | 0 |
| 21.06.2014 19:00 - 20:00 | 0 | 0 | 0 | 0 |
| 21.06.2014 20:00 - 21:00 | 0 | 0 | 0 | 0 |
| 21.06.2014 21:00 - 22:00 | 0 | 0 | 0 | 0 |
| 21.06.2014 22:00 - 23:00 | 0 | 0 | 0 | 0 |
| 21.06.2014 23:00 - 24:00 | 0 | 0 | 0 | 0 |
| 22.06.2014 00:00 - 01:00 | 0 | 0 | 0 | 0 |
| 22.06.2014 01:00 - 02:00 | 0 | 0 | 0 | 0 |
| 22.06.2014 02:00 - 03:00 | 0 | 0 | 0 | 0 |
| 22.06.2014 03:00 - 04:00 | 0 | 0 | 0 | 0 |
| 22.06.2014 04:00 - 05:00 | 0 | 0 | 0 | 0 |
| 22.06.2014 05:00 - 06:00 | 0 | 0 | 0 | 0 |
| 22.06.2014 06:00 - 07:00 | 0 | 0 | 0 | 0 |
| 22.06.2014 07:00 - 08:00 | 0 | 0 | 0 | 0 |
| 22.06.2014 08:00 - 09:00 | 0 | 0 | 0 | 0 |
| 22.06.2014 09:00 - 10:00 | 0 | 0 | 0 | 0 |
| 22.06.2014 10:00 - 11:00 | 0 | 0 | 0 | 0 |
| 22.06.2014 11:00 - 12:00 | 0 | 0 | 0 | 0 |
| 22.06.2014 12:00 - 13:00 | 0 | 0 | 0 | 0 |
| 22.06.2014 13:00 - 14:00 | 0 | 0 | 0 | 0 |
| 22.06.2014 14:00 - 15:00 | 0 | 0 | 0 | 0 |
| 22.06.2014 15:00 - 16:00 | 0 | 0 | 0 | 0 |
| 22.06.2014 16:00 - 17:00 | 0 | 0 | 0 | 0 |
| 22.06.2014 17:00 - 18:00 | 0 | 0 | 0 | 0 |
| 22.06.2014 18:00 - 19:00 | 0 | 0 | 0 | 0 |
| 22.06.2014 19:00 - 20:00 | 0 | 0 | 0 | 0 |
| 22.06.2014 20:00 - 21:00 | 0 | 0 | 0 | 0 |
| 22.06.2014 21:00 - 22:00 | 0 | 0 | 0 | 0 |
| 22.06.2014 22:00 - 23:00 | 0 | -400 | 0 | 0 |
| 22.06.2014 23:00 - 24:00 | 0 | -400 | 0 | 0 |
| 23.06.2014 00:00 - 01:00 | 0 | -400 | 0 | 0 |
| 23.06.2014 01:00 - 02:00 | 0 | -400 | 0 | 0 |
| 23.06.2014 02:00 - 03:00 | 0 | -400 | 0 | 0 |
| 23.06.2014 03:00 - 04:00 | 0 | -400 | 0 | 0 |
| 23.06.2014 04:00 - 05:00 | 0 | -400 | 0 | 0 |
| 23.06.2014 05:00 - 06:00 | 0 | -400 | 0 | 0 |
| 23.06.2014 06:00 - 07:00 | 0 | 0 | 0 | 0 |
| 23.06.2014 07:00 - 08:00 | 0 | 0 | 0 | 0 |
| 23.06.2014 08:00 - 09:00 | 0 | 0 | 0 | 0 |
| 23.06.2014 09:00 - 10:00 | 0 | 0 | 0 | 0 |
| 23.06.2014 10:00 - 11:00 | 0 | 0 | 0 | 0 |
| 23.06.2014 11:00 - 12:00 | 0 | 0 | 0 | 0 |
| 23.06.2014 12:00 - 13:00 | 0 | 0 | 0 | 0 |
| 23.06.2014 13:00 - 14:00 | 0 | 0 | 0 | 0 |
| 23.06.2014 14:00 - 15:00 | 0 | 0 | 0 | 0 |
| 23.06.2014 15:00 - 16:00 | 0 | 0 | 0 | 0 |
| 23.06.2014 16:00 - 17:00 | 0 | 0 | 0 | 0 |
| 23.06.2014 17:00 - 18:00 | 0 | 0 | 0 | 0 |
| 23.06.2014 18:00 - 19:00 | 0 | 0 | 0 | 0 |
| 23.06.2014 19:00 - 20:00 | 0 | 0 | 0 | 0 |
| 23.06.2014 20:00 - 21:00 | 0 | 0 | 0 | 0 |
| 23.06.2014 21:00 - 22:00 | 0 | 0 | 0 | 0 |
| 23.06.2014 22:00 - 23:00 | 0 | 0 | 0 | 0 |
| 23.06.2014 23:00 - 24:00 | 0 | 0 | 0 | 0 |
| 24.06.2014 00:00 - 01:00 | 0 | 0 | 0 | 0 |
| 24.06.2014 01:00 - 02:00 | 0 | 0 | 0 | 0 |
| 24.06.2014 02:00 - 03:00 | 0 | 0 | 0 | 0 |
| 24.06.2014 03:00 - 04:00 | 0 | 0 | 0 | 0 |
| 24.06.2014 04:00 - 05:00 | 0 | 0 | 0 | 0 |
| 24.06.2014 05:00 - 06:00 | 0 | 0 | 0 | 0 |
| 24.06.2014 06:00 - 07:00 | 0 | 0 | 0 | 0 |
| 24.06.2014 07:00 - 08:00 | 0 | 0 | 0 | 0 |
| 24.06.2014 08:00 - 09:00 | 0 | 0 | 0 | 0 |
| 24.06.2014 09:00 - 10:00 | 0 | 0 | 0 | 0 |
| 24.06.2014 10:00 - 11:00 | 0 | 0 | 0 | 0 |
| 24.06.2014 11:00 - 12:00 | 0 | 0 | 0 | 0 |
| 24.06.2014 12:00 - 13:00 | 0 | 0 | 0 | 0 |
| 24.06.2014 13:00 - 14:00 | 0 | 0 | 0 | 0 |
| 24.06.2014 14:00 - 15:00 | 0 | 0 | 0 | 0 |
| 24.06.2014 15:00 - 16:00 | 0 | 0 | 0 | 0 |
| 24.06.2014 16:00 - 17:00 | 0 | 0 | 0 | 0 |
| 24.06.2014 17:00 - 18:00 | 0 | 0 | 0 | 0 |
| 24.06.2014 18:00 - 19:00 | 0 | 0 | 0 | 0 |
| 24.06.2014 19:00 - 20:00 | 0 | 0 | 0 | 0 |
| 24.06.2014 20:00 - 21:00 | 0 | 0 | 0 | 0 |
| 24.06.2014 21:00 - 22:00 | 0 | 0 | 0 | 0 |
| 24.06.2014 22:00 - 23:00 | 0 | 0 | 0 | 0 |
| 24.06.2014 23:00 - 24:00 | 0 | 0 | 0 | 0 |
| 25.06.2014 00:00 - 01:00 | 0 | 0 | 0 | 0 |
| 25.06.2014 01:00 - 02:00 | 700 | 0 | 0 | 0 |
| 25.06.2014 02:00 - 03:00 | 1000 | 0 | 0 | 0 |
| 25.06.2014 03:00 - 04:00 | 1000 | 0 | 0 | 0 |
| 25.06.2014 04:00 - 05:00 | 1000 | 0 | 0 | 0 |
| 25.06.2014 05:00 - 06:00 | 1000 | 0 | 0 | 0 |
| 25.06.2014 06:00 - 07:00 | 0 | 0 | 0 | 0 |
| 25.06.2014 07:00 - 08:00 | 0 | 0 | 0 | 0 |
| 25.06.2014 08:00 - 09:00 | 0 | 0 | 0 | 0 |
| 25.06.2014 09:00 - 10:00 | 0 | 0 | 0 | 0 |
| 25.06.2014 10:00 - 11:00 | 0 | 0 | 0 | 0 |
| 25.06.2014 11:00 - 12:00 | 0 | 0 | 0 | 0 |
| 25.06.2014 12:00 - 13:00 | 0 | 0 | 0 | 0 |
| 25.06.2014 13:00 - 14:00 | 0 | 0 | 0 | 0 |
| 25.06.2014 14:00 - 15:00 | 0 | 0 | 0 | 0 |
| 25.06.2014 15:00 - 16:00 | 0 | 0 | 0 | 0 |
| 25.06.2014 16:00 - 17:00 | 0 | 0 | 0 | 0 |
| 25.06.2014 17:00 - 18:00 | 0 | 0 | 0 | 0 |
| 25.06.2014 18:00 - 19:00 | 0 | 0 | 0 | 0 |
| 25.06.2014 19:00 - 20:00 | 0 | 0 | 0 | 0 |
| 25.06.2014 20:00 - 21:00 | 0 | 0 | 0 | 0 |
| 25.06.2014 21:00 - 22:00 | 0 | 0 | 0 | 0 |
| 25.06.2014 22:00 - 23:00 | 0 | 0 | 0 | 0 |
| 25.06.2014 23:00 - 24:00 | 0 | 0 | 0 | 0 |
| 26.06.2014 00:00 - 01:00 | 0 | 0 | 0 | 0 |
| 26.06.2014 01:00 - 02:00 | 0 | 0 | 0 | 0 |
| 26.06.2014 02:00 - 03:00 | 0 | 0 | 0 | 0 |
| 26.06.2014 03:00 - 04:00 | 0 | 0 | 0 | 0 |
| 26.06.2014 04:00 - 05:00 | 0 | 0 | 0 | 0 |
| 26.06.2014 05:00 - 06:00 | 0 | 0 | 0 | 0 |
| 26.06.2014 06:00 - 07:00 | 0 | 0 | 0 | 0 |
| 26.06.2014 07:00 - 08:00 | 0 | 0 | 0 | 0 |
| 26.06.2014 08:00 - 09:00 | 0 | 0 | 0 | 0 |
| 26.06.2014 09:00 - 10:00 | 0 | 0 | 0 | 0 |
| 26.06.2014 10:00 - 11:00 | 0 | 0 | 0 | 0 |
| 26.06.2014 11:00 - 12:00 | 0 | 0 | 0 | 0 |
| 26.06.2014 12:00 - 13:00 | 0 | 0 | 0 | 0 |
| 26.06.2014 13:00 - 14:00 | 0 | 0 | 0 | 0 |
| 26.06.2014 14:00 - 15:00 | 300 | 0 | 0 | 0 |
| 26.06.2014 15:00 - 16:00 | 300 | 0 | 0 | 0 |
| 26.06.2014 16:00 - 17:00 | 300 | 0 | 0 | 0 |
| 26.06.2014 17:00 - 18:00 | 300 | 0 | 0 | 0 |
| 26.06.2014 18:00 - 19:00 | 300 | 0 | 0 | 0 |
| 26.06.2014 19:00 - 20:00 | 300 | 0 | 0 | 0 |
| 26.06.2014 20:00 - 21:00 | 300 | 0 | 0 | 0 |
| 26.06.2014 21:00 - 22:00 | 300 | 0 | 0 | 0 |
| 26.06.2014 22:00 - 23:00 | 300 | 0 | 0 | 0 |
| 26.06.2014 23:00 - 24:00 | 300 | 0 | 0 | 0 |
| 27.06.2014 00:00 - 01:00 | 300 | 0 | 0 | 0 |
| 27.06.2014 01:00 - 02:00 | 300 | 0 | 0 | 0 |
| 27.06.2014 02:00 - 03:00 | 300 | 0 | 0 | 0 |
| 27.06.2014 03:00 - 04:00 | 300 | 0 | 0 | 0 |
| 27.06.2014 04:00 - 05:00 | 300 | 0 | 0 | 0 |
| 27.06.2014 05:00 - 06:00 | 300 | 0 | 0 | 0 |
| 27.06.2014 06:00 - 07:00 | 0 | 0 | 0 | 0 |
| 27.06.2014 07:00 - 08:00 | 0 | 0 | 0 | 0 |
| 27.06.2014 08:00 - 09:00 | 0 | 0 | 0 | 0 |
| 27.06.2014 09:00 - 10:00 | 0 | 0 | 0 | 0 |
| 27.06.2014 10:00 - 11:00 | 0 | 0 | 0 | 0 |
| 27.06.2014 11:00 - 12:00 | 0 | 0 | 0 | 0 |
| 27.06.2014 12:00 - 13:00 | 0 | 0 | 0 | 0 |
| 27.06.2014 13:00 - 14:00 | 0 | 0 | 0 | 0 |
| 27.06.2014 14:00 - 15:00 | 0 | 0 | 0 | 0 |
| 27.06.2014 15:00 - 16:00 | 0 | 0 | 0 | 0 |
| 27.06.2014 16:00 - 17:00 | 0 | 0 | 0 | 0 |
| 27.06.2014 17:00 - 18:00 | 0 | 0 | 0 | 0 |
| 27.06.2014 18:00 - 19:00 | 0 | 0 | 0 | 0 |
| 27.06.2014 19:00 - 20:00 | 300 | 0 | 0 | 0 |
| 27.06.2014 20:00 - 21:00 | 500 | 0 | 0 | 0 |
| 27.06.2014 21:00 - 22:00 | 500 | 0 | 0 | 0 |
| 27.06.2014 22:00 - 23:00 | 500 | 0 | 0 | 0 |
| 27.06.2014 23:00 - 24:00 | 500 | 0 | 0 | 0 |
| 28.06.2014 00:00 - 01:00 | 500 | 0 | 0 | 0 |
| 28.06.2014 01:00 - 02:00 | 500 | 0 | 0 | 0 |
| 28.06.2014 02:00 - 03:00 | 500 | 0 | 0 | 0 |
| 28.06.2014 03:00 - 04:00 | 500 | 0 | 0 | 0 |
| 28.06.2014 04:00 - 05:00 | 500 | 0 | 0 | 0 |
| 28.06.2014 05:00 - 06:00 | 500 | 0 | 0 | 0 |
| 28.06.2014 06:00 - 07:00 | 0 | 0 | 0 | 0 |
| 28.06.2014 07:00 - 08:00 | 0 | 0 | 0 | 0 |
| 28.06.2014 08:00 - 09:00 | 0 | 0 | 0 | 0 |
| 28.06.2014 09:00 - 10:00 | 0 | 0 | 0 | 0 |
| 28.06.2014 10:00 - 11:00 | 0 | 0 | 0 | 0 |
| 28.06.2014 11:00 - 12:00 | 0 | 0 | 0 | 0 |
| 28.06.2014 12:00 - 13:00 | 0 | 0 | 0 | 0 |
| 28.06.2014 13:00 - 14:00 | 0 | 0 | 0 | 0 |
| 28.06.2014 14:00 - 15:00 | 0 | 0 | 0 | 0 |
| 28.06.2014 15:00 - 16:00 | 0 | 0 | 0 | 0 |
| 28.06.2014 16:00 - 17:00 | 0 | 0 | 0 | 0 |
| 28.06.2014 17:00 - 18:00 | 0 | 0 | 0 | 0 |
| 28.06.2014 18:00 - 19:00 | 0 | 0 | 0 | 0 |
| 28.06.2014 19:00 - 20:00 | 0 | 0 | 0 | 0 |
| 28.06.2014 20:00 - 21:00 | 0 | 0 | 0 | 0 |
| 28.06.2014 21:00 - 22:00 | 0 | 0 | 0 | 0 |
| 28.06.2014 22:00 - 23:00 | 0 | 0 | 0 | 0 |
| 28.06.2014 23:00 - 24:00 | 0 | 0 | 0 | 0 |
| 29.06.2014 00:00 - 01:00 | 0 | 0 | 0 | 0 |
| 29.06.2014 01:00 - 02:00 | 0 | 0 | 0 | 0 |
| 29.06.2014 02:00 - 03:00 | 0 | 0 | 0 | 0 |
| 29.06.2014 03:00 - 04:00 | 0 | 0 | 0 | 0 |
| 29.06.2014 04:00 - 05:00 | 0 | 0 | 0 | 0 |
| 29.06.2014 05:00 - 06:00 | 0 | 0 | 0 | 0 |
| 29.06.2014 06:00 - 07:00 | 0 | 0 | 0 | 0 |
| 29.06.2014 07:00 - 08:00 | 0 | 0 | 0 | 0 |
| 29.06.2014 08:00 - 09:00 | 0 | 0 | 0 | 0 |
| 29.06.2014 09:00 - 10:00 | 0 | 0 | 0 | 0 |
| 29.06.2014 10:00 - 11:00 | 0 | 0 | 0 | 0 |
| 29.06.2014 11:00 - 12:00 | 0 | 0 | 0 | 0 |
| 29.06.2014 12:00 - 13:00 | 0 | 0 | 0 | 0 |
| 29.06.2014 13:00 - 14:00 | 0 | 0 | 0 | 0 |
| 29.06.2014 14:00 - 15:00 | 0 | 0 | 0 | 0 |
| 29.06.2014 15:00 - 16:00 | 0 | 0 | 0 | 0 |
| 29.06.2014 16:00 - 17:00 | 0 | 0 | 0 | 0 |
| 29.06.2014 17:00 - 18:00 | 0 | 0 | 0 | 0 |
| 29.06.2014 18:00 - 19:00 | 0 | 0 | 0 | 0 |
| 29.06.2014 19:00 - 20:00 | 0 | 0 | 0 | 0 |
| 29.06.2014 20:00 - 21:00 | 0 | 0 | 0 | 0 |
| 29.06.2014 21:00 - 22:00 | 0 | 0 | 0 | 0 |
| 29.06.2014 22:00 - 23:00 | 0 | 0 | 0 | 0 |
| 29.06.2014 23:00 - 24:00 | 0 | 0 | 0 | 0 |
| 30.06.2014 00:00 - 01:00 | 0 | 0 | 0 | 0 |
| 30.06.2014 01:00 - 02:00 | 0 | 0 | 0 | 0 |
| 30.06.2014 02:00 - 03:00 | 0 | 0 | 0 | 0 |
| 30.06.2014 03:00 - 04:00 | 0 | 0 | 0 | 0 |
| 30.06.2014 04:00 - 05:00 | 0 | 0 | 0 | 0 |
| 30.06.2014 05:00 - 06:00 | 0 | 0 | 0 | 0 |
| 30.06.2014 06:00 - 07:00 | 0 | 0 | 0 | 0 |
| 30.06.2014 07:00 - 08:00 | 0 | 0 | 0 | 0 |
| 30.06.2014 08:00 - 09:00 | 0 | 0 | 0 | 0 |
| 30.06.2014 09:00 - 10:00 | 0 | 0 | 0 | 0 |
| 30.06.2014 10:00 - 11:00 | 0 | 0 | 0 | 0 |
| 30.06.2014 11:00 - 12:00 | 0 | 0 | 0 | 0 |
| 30.06.2014 12:00 - 13:00 | 0 | 0 | 0 | 0 |
| 30.06.2014 13:00 - 14:00 | 0 | 0 | 0 | 0 |
| 30.06.2014 14:00 - 15:00 | 0 | 0 | 0 | 0 |
| 30.06.2014 15:00 - 16:00 | 0 | 0 | 0 | 0 |
| 30.06.2014 16:00 - 17:00 | 0 | 0 | 0 | 0 |
| 30.06.2014 17:00 - 18:00 | 0 | 0 | 0 | 0 |
| 30.06.2014 18:00 - 19:00 | 0 | 0 | 0 | 0 |
| 30.06.2014 19:00 - 20:00 | 0 | 0 | 0 | 0 |
| 30.06.2014 20:00 - 21:00 | 0 | 0 | 0 | 0 |
| 30.06.2014 21:00 - 22:00 | 0 | 0 | 0 | 0 |
| 30.06.2014 22:00 - 23:00 | 0 | 0 | 0 | 0 |
| 30.06.2014 23:00 - 24:00 | 0 | 0 | 0 | 0 |
| 01.07.2014 00:00 - 01:00 | 0 | 0 | 0 | 0 |
| 01.07.2014 01:00 - 02:00 | 0 | 0 | 0 | 0 |
| 01.07.2014 02:00 - 03:00 | 0 | 0 | 0 | 0 |
| 01.07.2014 03:00 - 04:00 | 0 | 0 | 0 | 0 |
| 01.07.2014 04:00 - 05:00 | 0 | 0 | 0 | 0 |
| 01.07.2014 05:00 - 06:00 | 0 | 0 | 0 | 0 |